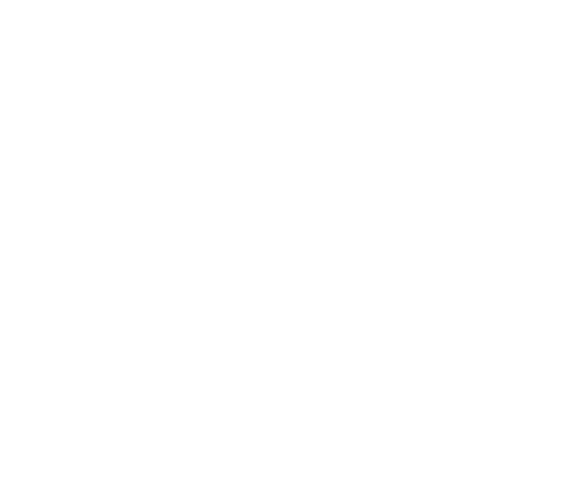
| Category | Series 0 |
|---|---|
| Live | 0 |
| Give | 0 |
| Owe: Debt | 0 |
| Owe: Taxes | 0 |
| Grow | 0 |